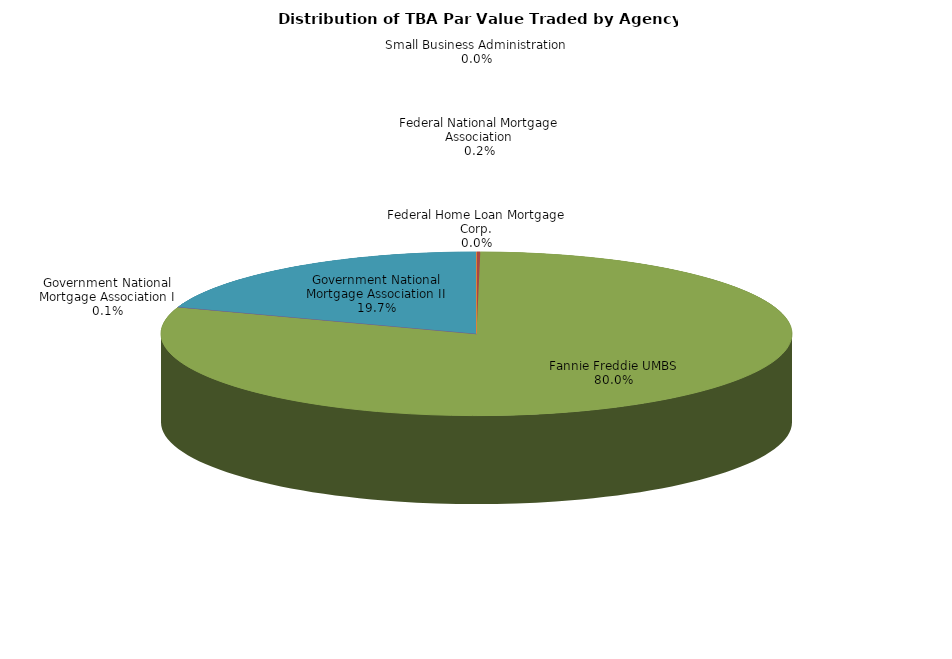
| Category | Series 0 |
|---|---|
| Federal Home Loan Mortgage Corp. | 20627378.548 |
| Federal National Mortgage Association | 466107588.071 |
| Fannie Freddie UMBS | 203454124885.943 |
| Government National Mortgage Association I | 213564579.937 |
| Government National Mortgage Association II | 50015901965.159 |
| Small Business Administration | 10961298.282 |